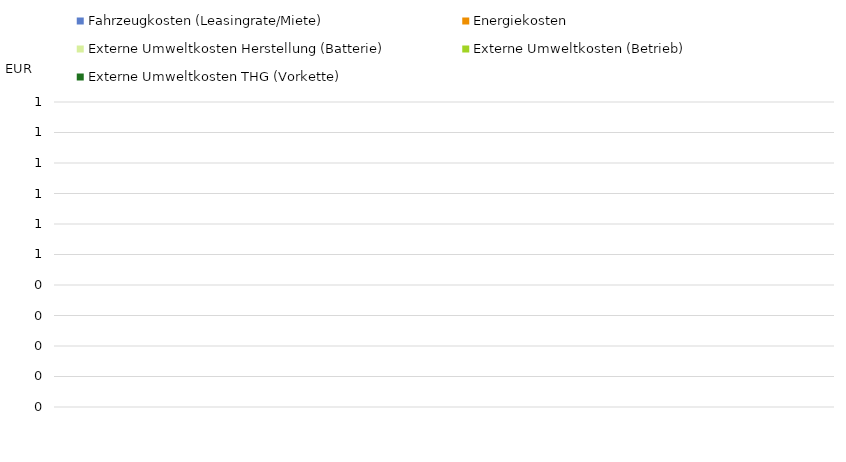
| Category | Fahrzeugkosten (Leasingrate/Miete) | Energiekosten | Externe Umweltkosten Herstellung (Batterie) | Externe Umweltkosten (Betrieb) | Externe Umweltkosten THG (Vorkette) |
|---|---|---|---|---|---|
|     | 0 | 0 | 0 | 0 | 0 |
|     | 0 | 0 | 0 | 0 | 0 |
|     | 0 | 0 | 0 | 0 | 0 |
|     | 0 | 0 | 0 | 0 | 0 |
|     | 0 | 0 | 0 | 0 | 0 |